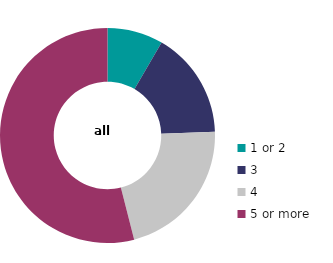
| Category | all dwellings |
|---|---|
| 1 or 2 | 8.395 |
| 3 | 16.054 |
| 4 | 21.556 |
| 5 or more | 53.995 |